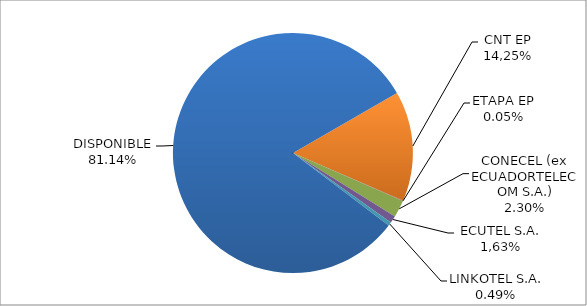
| Category | CODIGO DE AREA 4 |
|---|---|
| CORPORACIÓN NACIONAL TELECOMUNICACIONES CNT EP | 0.148 |
| ETAPA EP | 0.001 |
| CONECEL (ex ECUADORTELECOM S.A.) | 0.023 |
| SETEL S.A. | 0.01 |
| LINKOTEL S.A. | 0.005 |
| DISPONIBLE | 0.811 |